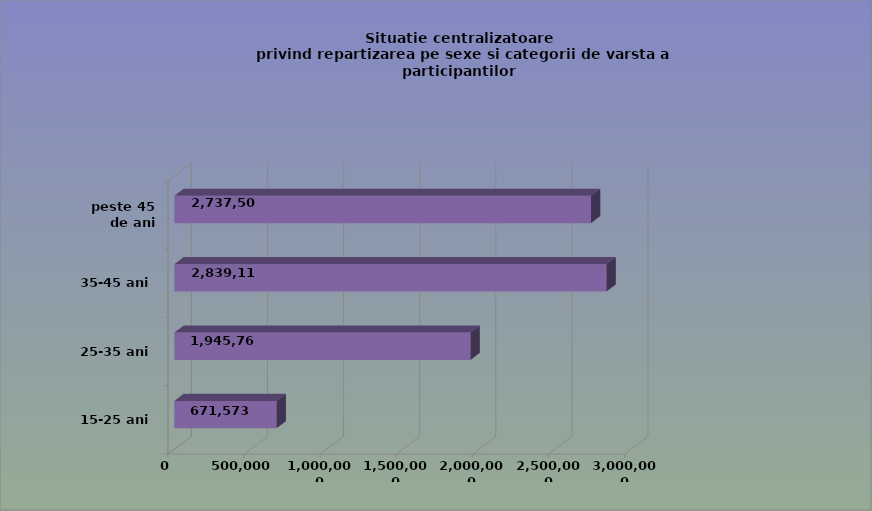
| Category | 15-25 ani 25-35 ani 35-45 ani peste 45 de ani |
|---|---|
| 15-25 ani | 671573 |
| 25-35 ani | 1945762 |
| 35-45 ani | 2839113 |
| peste 45 de ani | 2737507 |